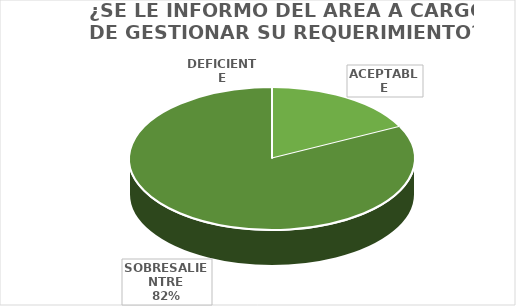
| Category | Series 0 |
|---|---|
| DEFICIENTE | 0 |
| ACEPTABLE | 3 |
| SOBRESALIENTRE | 14 |